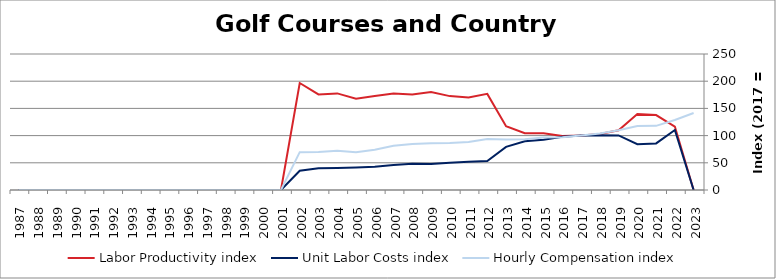
| Category | Labor Productivity index | Unit Labor Costs index | Hourly Compensation index |
|---|---|---|---|
| 2023.0 | 0 | 0 | 141.501 |
| 2022.0 | 116.625 | 110.277 | 128.61 |
| 2021.0 | 137.709 | 85.652 | 117.951 |
| 2020.0 | 139.575 | 84.3 | 117.661 |
| 2019.0 | 109.64 | 100.319 | 109.99 |
| 2018.0 | 103.001 | 100.811 | 103.836 |
| 2017.0 | 100 | 100 | 100 |
| 2016.0 | 99.321 | 97.859 | 97.195 |
| 2015.0 | 104.518 | 92.383 | 96.557 |
| 2014.0 | 104.309 | 89.478 | 93.334 |
| 2013.0 | 117.381 | 79.27 | 93.048 |
| 2012.0 | 176.69 | 53.088 | 93.801 |
| 2011.0 | 170.194 | 51.838 | 88.226 |
| 2010.0 | 172.573 | 50.047 | 86.368 |
| 2009.0 | 179.927 | 47.815 | 86.031 |
| 2008.0 | 175.474 | 48.255 | 84.675 |
| 2007.0 | 177.474 | 45.733 | 81.164 |
| 2006.0 | 172.749 | 42.789 | 73.917 |
| 2005.0 | 167.955 | 41.32 | 69.399 |
| 2004.0 | 177.568 | 40.54 | 71.987 |
| 2003.0 | 175.635 | 39.864 | 70.014 |
| 2002.0 | 196.675 | 35.397 | 69.617 |
| 2001.0 | 0 | 0 | 0 |
| 2000.0 | 0 | 0 | 0 |
| 1999.0 | 0 | 0 | 0 |
| 1998.0 | 0 | 0 | 0 |
| 1997.0 | 0 | 0 | 0 |
| 1996.0 | 0 | 0 | 0 |
| 1995.0 | 0 | 0 | 0 |
| 1994.0 | 0 | 0 | 0 |
| 1993.0 | 0 | 0 | 0 |
| 1992.0 | 0 | 0 | 0 |
| 1991.0 | 0 | 0 | 0 |
| 1990.0 | 0 | 0 | 0 |
| 1989.0 | 0 | 0 | 0 |
| 1988.0 | 0 | 0 | 0 |
| 1987.0 | 0 | 0 | 0 |